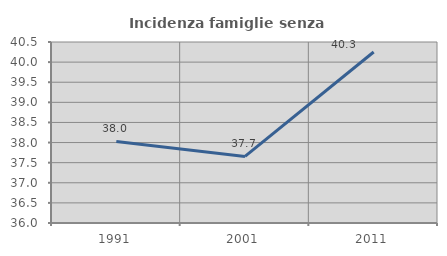
| Category | Incidenza famiglie senza nuclei |
|---|---|
| 1991.0 | 38.028 |
| 2001.0 | 37.654 |
| 2011.0 | 40.252 |